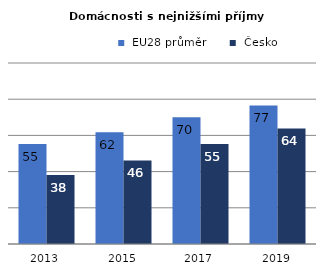
| Category |  EU28 průměr |  Česko |
|---|---|---|
| 2013.0 | 55.195 | 38.132 |
| 2015.0 | 61.802 | 46.145 |
| 2017.0 | 69.982 | 55.226 |
| 2019.0 | 76.537 | 63.849 |